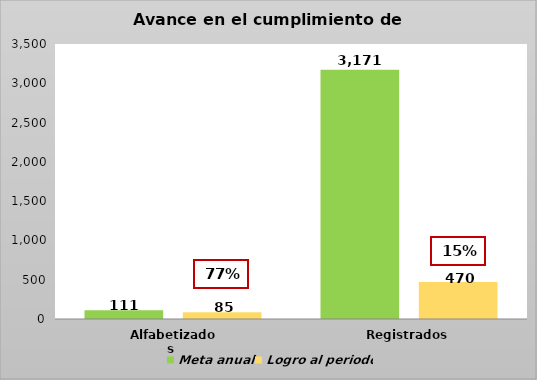
| Category | Meta anual | Logro al periodo |
|---|---|---|
| Alfabetizados  | 111 | 85 |
| Registrados | 3171 | 470 |